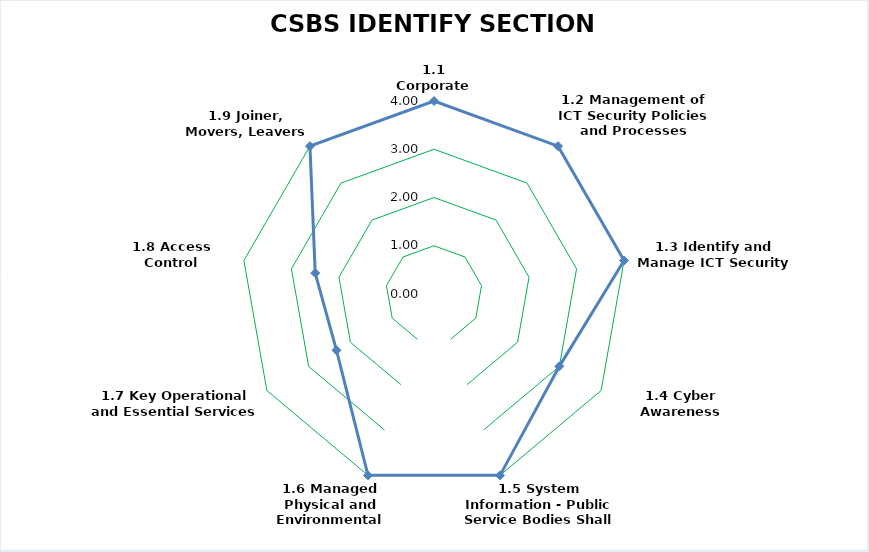
| Category | IDENTIFY (ID) OVERVIEW
Develop the organisational understanding, structures, policies and processes to manage cybersecurity risk to the network and information systems  of the organisations essential services, assets, data, and capabilities. |
|---|---|
| 1.1 Corporate Responsibility | 4 |
| 1.2 Management of ICT Security Policies and Processes | 4 |
| 1.3 Identify and Manage ICT Security Risks | 4 |
| 1.4 Cyber Awareness Training | 3 |
| 1.5 System Information - Public Service Bodies Shall Know and Record | 4 |
| 1.6 Managed Physical and Environmental Access Control | 4 |
| 1.7 Key Operational and Essential Services | 2.333 |
| 1.8 Access Control Procedures | 2.5 |
| 1.9 Joiner, Movers, Leavers Policy | 4 |